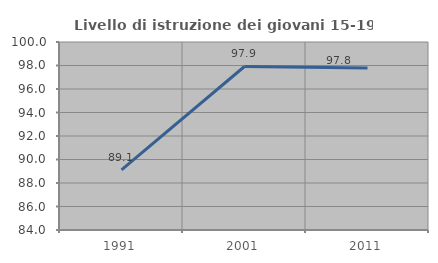
| Category | Livello di istruzione dei giovani 15-19 anni |
|---|---|
| 1991.0 | 89.123 |
| 2001.0 | 97.917 |
| 2011.0 | 97.79 |